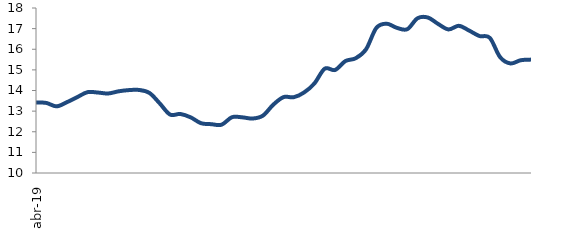
| Category | Series 0 |
|---|---|
| 2019-04-01 | 13.419 |
| 2019-05-01 | 13.397 |
| 2019-06-01 | 13.231 |
| 2019-07-01 | 13.433 |
| 2019-08-01 | 13.679 |
| 2019-09-01 | 13.92 |
| 2019-10-01 | 13.901 |
| 2019-11-01 | 13.855 |
| 2019-12-01 | 13.96 |
| 2020-01-01 | 14.019 |
| 2020-02-01 | 14.026 |
| 2020-03-01 | 13.882 |
| 2020-04-01 | 13.374 |
| 2020-05-01 | 12.833 |
| 2020-06-01 | 12.862 |
| 2020-07-01 | 12.698 |
| 2020-08-01 | 12.414 |
| 2020-09-01 | 12.367 |
| 2020-10-01 | 12.342 |
| 2020-11-01 | 12.705 |
| 2020-12-01 | 12.699 |
| 2021-01-01 | 12.641 |
| 2021-02-01 | 12.779 |
| 2021-03-01 | 13.308 |
| 2021-04-01 | 13.679 |
| 2021-05-01 | 13.675 |
| 2021-06-01 | 13.905 |
| 2021-07-01 | 14.345 |
| 2021-08-01 | 15.059 |
| 2021-09-01 | 14.995 |
| 2021-10-01 | 15.427 |
| 2021-11-01 | 15.564 |
| 2021-12-01 | 15.993 |
| 2022-01-01 | 17.032 |
| 2022-02-01 | 17.239 |
| 2022-03-01 | 17.037 |
| 2022-04-01 | 16.972 |
| 2022-05-01 | 17.503 |
| 2022-06-01 | 17.537 |
| 2022-07-01 | 17.225 |
| 2022-08-01 | 16.961 |
| 2022-09-01 | 17.136 |
| 2022-10-01 | 16.906 |
| 2022-11-01 | 16.642 |
| 2022-12-01 | 16.555 |
| 2023-01-01 | 15.621 |
| 2023-02-01 | 15.312 |
| 2023-03-01 | 15.467 |
| 2023-04-01 | 15.498 |